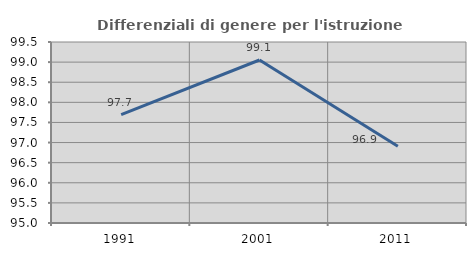
| Category | Differenziali di genere per l'istruzione superiore |
|---|---|
| 1991.0 | 97.697 |
| 2001.0 | 99.052 |
| 2011.0 | 96.908 |